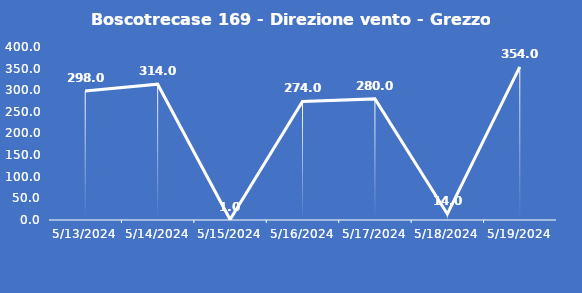
| Category | Boscotrecase 169 - Direzione vento - Grezzo (°N) |
|---|---|
| 5/13/24 | 298 |
| 5/14/24 | 314 |
| 5/15/24 | 1 |
| 5/16/24 | 274 |
| 5/17/24 | 280 |
| 5/18/24 | 14 |
| 5/19/24 | 354 |